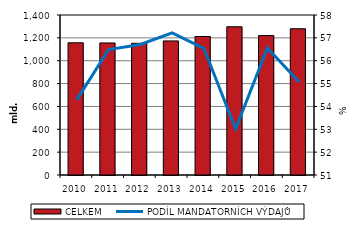
| Category | CELKEM  |
|---|---|
| 2010.0 | 1156793 |
| 2011.0 | 1155526 |
| 2012.0 | 1152387 |
| 2013.0 | 1173128 |
| 2014.0 | 1211608 |
| 2015.0 | 1297321.588 |
| 2016.0 | 1219843.518 |
| 2017.0 | 1279795.656 |